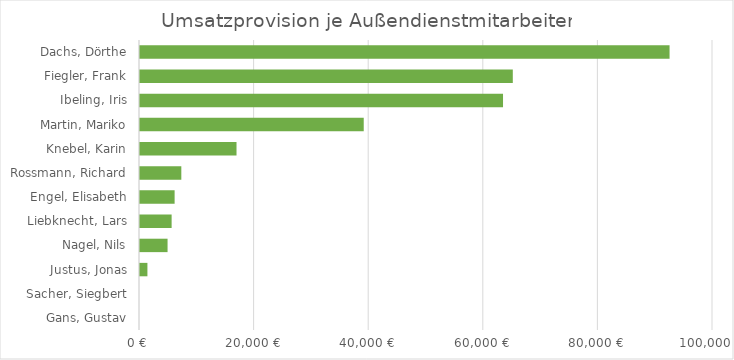
| Category | Series 0 |
|---|---|
| Gans, Gustav | 0 |
| Sacher, Siegbert | 0 |
| Justus, Jonas | 1294.52 |
| Nagel, Nils | 4810.08 |
| Liebknecht, Lars | 5519.14 |
| Engel, Elisabeth | 6040.96 |
| Rossmann, Richard | 7211.42 |
| Knebel, Karin | 16843.92 |
| Martin, Mariko | 39046.35 |
| Ibeling, Iris | 63355.25 |
| Fiegler, Frank | 65061.64 |
| Dachs, Dörthe | 92419.76 |